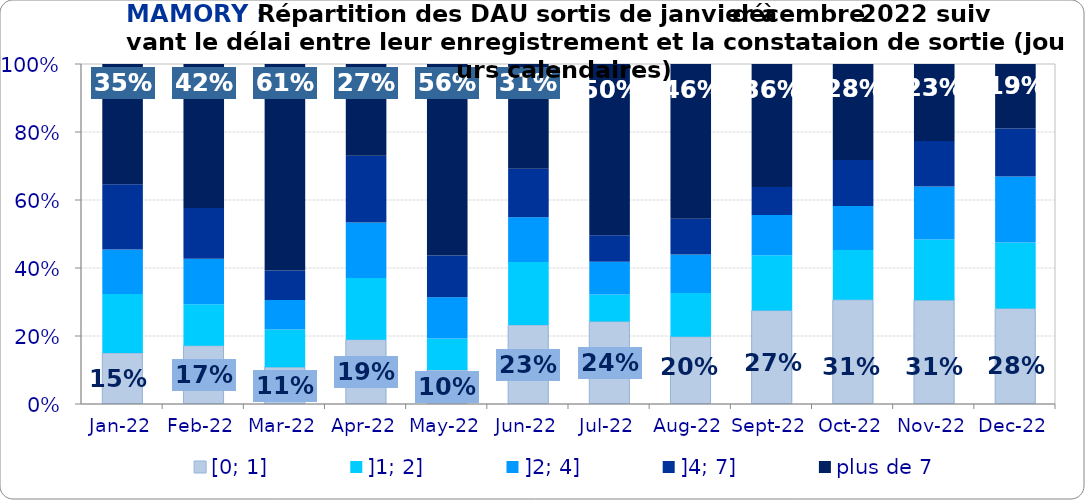
| Category | [0; 1] | ]1; 2] | ]2; 4] | ]4; 7] | plus de 7 |
|---|---|---|---|---|---|
| 2022-01-01 | 0.15 | 0.173 | 0.131 | 0.192 | 0.354 |
| 2022-02-01 | 0.171 | 0.122 | 0.134 | 0.149 | 0.423 |
| 2022-03-01 | 0.108 | 0.111 | 0.087 | 0.086 | 0.608 |
| 2022-04-01 | 0.189 | 0.182 | 0.163 | 0.197 | 0.27 |
| 2022-05-01 | 0.1 | 0.093 | 0.121 | 0.123 | 0.563 |
| 2022-06-01 | 0.232 | 0.186 | 0.131 | 0.143 | 0.308 |
| 2022-07-01 | 0.242 | 0.08 | 0.096 | 0.078 | 0.504 |
| 2022-08-01 | 0.198 | 0.129 | 0.113 | 0.105 | 0.455 |
| 2022-09-01 | 0.275 | 0.163 | 0.118 | 0.083 | 0.362 |
| 2022-10-01 | 0.306 | 0.147 | 0.129 | 0.135 | 0.282 |
| 2022-11-01 | 0.305 | 0.178 | 0.156 | 0.134 | 0.227 |
| 2022-12-01 | 0.281 | 0.195 | 0.193 | 0.142 | 0.19 |